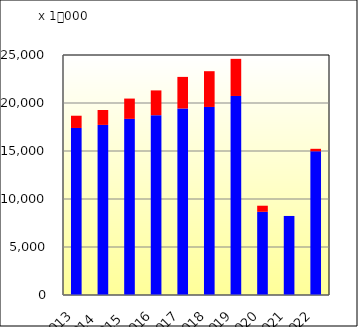
| Category | DOM | INT |
|---|---|---|
| 2013.0 | 17398764 | 1275580 |
| 2014.0 | 17717548 | 1553374 |
| 2015.0 | 18348794 | 2112737 |
| 2016.0 | 18732019 | 2579899 |
| 2017.0 | 19428246 | 3290366 |
| 2018.0 | 19587471 | 3725840 |
| 2019.0 | 20732744 | 3866519 |
| 2020.0 | 8665563 | 634398 |
| 2021.0 | 8233413 | 25 |
| 2022.0 | 14970359 | 257382 |